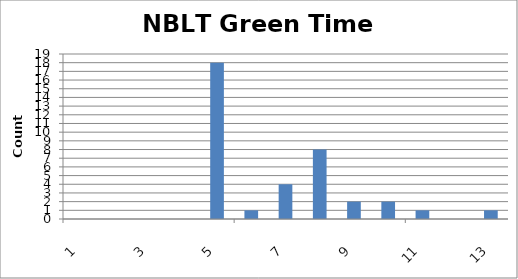
| Category | Series 0 |
|---|---|
| 0 | 0 |
| 1 | 0 |
| 2 | 0 |
| 3 | 0 |
| 4 | 18 |
| 5 | 1 |
| 6 | 4 |
| 7 | 8 |
| 8 | 2 |
| 9 | 2 |
| 10 | 1 |
| 11 | 0 |
| 12 | 1 |